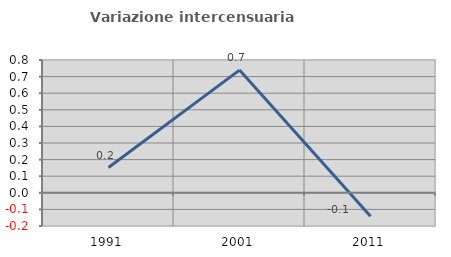
| Category | Variazione intercensuaria annua |
|---|---|
| 1991.0 | 0.152 |
| 2001.0 | 0.739 |
| 2011.0 | -0.141 |